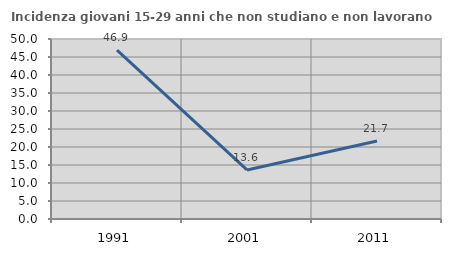
| Category | Incidenza giovani 15-29 anni che non studiano e non lavorano  |
|---|---|
| 1991.0 | 46.893 |
| 2001.0 | 13.625 |
| 2011.0 | 21.667 |